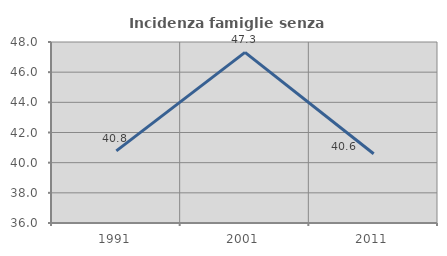
| Category | Incidenza famiglie senza nuclei |
|---|---|
| 1991.0 | 40.782 |
| 2001.0 | 47.312 |
| 2011.0 | 40.588 |